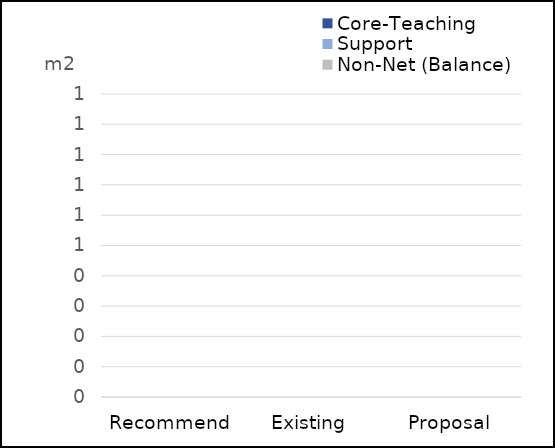
| Category | Core-Teaching | Support | Non-Net (Balance) |
|---|---|---|---|
| Recommend | 0 | 0 | 0 |
| Existing | 0 | 0 | 0 |
| Proposal | 0 | 0 | 0 |